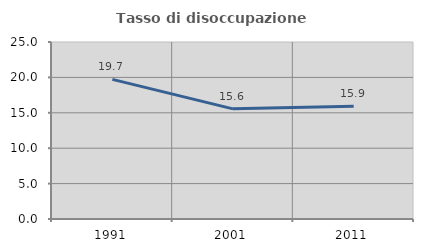
| Category | Tasso di disoccupazione giovanile  |
|---|---|
| 1991.0 | 19.718 |
| 2001.0 | 15.556 |
| 2011.0 | 15.909 |